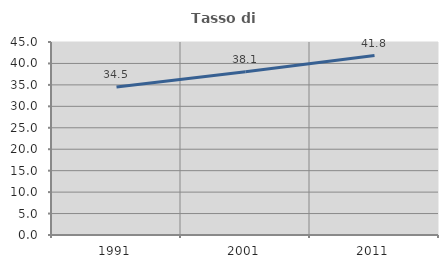
| Category | Tasso di occupazione   |
|---|---|
| 1991.0 | 34.517 |
| 2001.0 | 38.066 |
| 2011.0 | 41.833 |